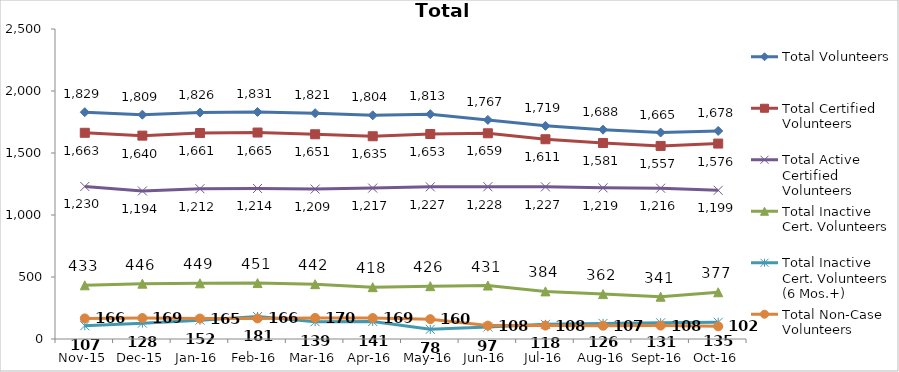
| Category | Total Volunteers | Total Certified Volunteers | Total Active Certified Volunteers | Total Inactive Cert. Volunteers | Total Inactive Cert. Volunteers (6 Mos.+) | Total Non-Case Volunteers |
|---|---|---|---|---|---|---|
| Nov-15 | 1829 | 1663 | 1230 | 433 | 107 | 166 |
| Dec-15 | 1809 | 1640 | 1194 | 446 | 128 | 169 |
| Jan-16 | 1826 | 1661 | 1212 | 449 | 152 | 165 |
| Feb-16 | 1831 | 1665 | 1214 | 451 | 181 | 166 |
| Mar-16 | 1821 | 1651 | 1209 | 442 | 139 | 170 |
| Apr-16 | 1804 | 1635 | 1217 | 418 | 141 | 169 |
| May-16 | 1813 | 1653 | 1227 | 426 | 78 | 160 |
| Jun-16 | 1767 | 1659 | 1228 | 431 | 97 | 108 |
| Jul-16 | 1719 | 1611 | 1227 | 384 | 118 | 108 |
| Aug-16 | 1688 | 1581 | 1219 | 362 | 126 | 107 |
| Sep-16 | 1665 | 1557 | 1216 | 341 | 131 | 108 |
| Oct-16 | 1678 | 1576 | 1199 | 377 | 135 | 102 |